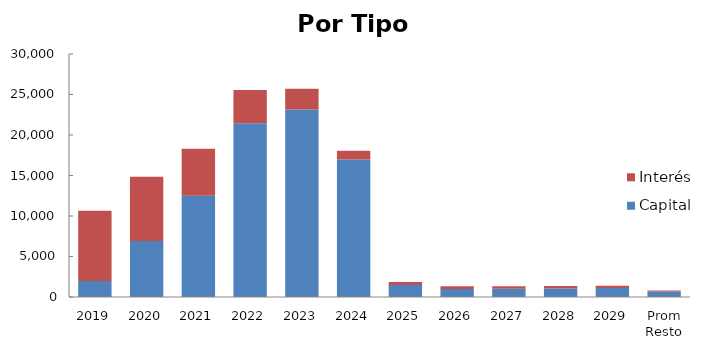
| Category | Capital | Interés |
|---|---|---|
| 2019 | 1961.771 | 8692.942 |
| 2020 | 6920.567 | 7930.827 |
| 2021 | 12493.18 | 5800.387 |
| 2022 | 21452.046 | 4109.14 |
| 2023 | 23142.258 | 2563.715 |
| 2024 | 16975.819 | 1072.42 |
| 2025 | 1468.836 | 383.106 |
| 2026 | 990.774 | 349.647 |
| 2027 | 1005.953 | 332.716 |
| 2028 | 1056.251 | 314.925 |
| 2029 | 1109.063 | 292.699 |
| Prom Resto | 687.107 | 104.225 |